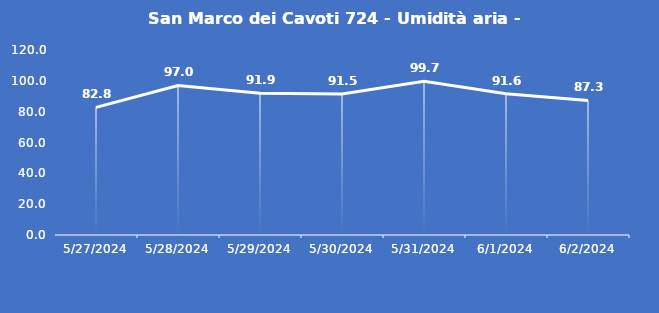
| Category | San Marco dei Cavoti 724 - Umidità aria - Grezzo (%) |
|---|---|
| 5/27/24 | 82.8 |
| 5/28/24 | 97 |
| 5/29/24 | 91.9 |
| 5/30/24 | 91.5 |
| 5/31/24 | 99.7 |
| 6/1/24 | 91.6 |
| 6/2/24 | 87.3 |